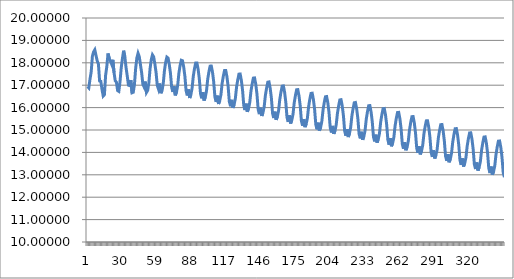
| Category | Series 0 |
|---|---|
| 0 | 16.938 |
| 1 | 16.879 |
| 2 | 17.272 |
| 3 | 17.599 |
| 4 | 18.294 |
| 5 | 18.489 |
| 6 | 18.58 |
| 7 | 18.329 |
| 8 | 18.087 |
| 9 | 17.94 |
| 10 | 17.188 |
| 11 | 17.172 |
| 12 | 16.805 |
| 13 | 16.517 |
| 14 | 16.576 |
| 15 | 17.443 |
| 16 | 17.838 |
| 17 | 18.416 |
| 18 | 18.199 |
| 19 | 18.082 |
| 20 | 17.944 |
| 21 | 18.134 |
| 22 | 17.564 |
| 23 | 17.202 |
| 24 | 17.134 |
| 25 | 16.757 |
| 26 | 16.724 |
| 27 | 17.165 |
| 28 | 17.783 |
| 29 | 18.194 |
| 30 | 18.541 |
| 31 | 18.272 |
| 32 | 17.789 |
| 33 | 17.416 |
| 34 | 17.002 |
| 35 | 16.983 |
| 36 | 17.225 |
| 37 | 16.662 |
| 38 | 16.685 |
| 39 | 17.031 |
| 40 | 17.749 |
| 41 | 18.217 |
| 42 | 18.428 |
| 43 | 18.281 |
| 44 | 17.919 |
| 45 | 17.555 |
| 46 | 17.044 |
| 47 | 16.927 |
| 48 | 17.162 |
| 49 | 16.676 |
| 50 | 16.769 |
| 51 | 17.101 |
| 52 | 17.737 |
| 53 | 18.137 |
| 54 | 18.353 |
| 55 | 18.268 |
| 56 | 17.952 |
| 57 | 17.569 |
| 58 | 16.993 |
| 59 | 16.828 |
| 60 | 17.075 |
| 61 | 16.643 |
| 62 | 16.771 |
| 63 | 17.083 |
| 64 | 17.664 |
| 65 | 18.025 |
| 66 | 18.253 |
| 67 | 18.212 |
| 68 | 17.924 |
| 69 | 17.524 |
| 70 | 16.899 |
| 71 | 16.7 |
| 72 | 16.951 |
| 73 | 16.547 |
| 74 | 16.692 |
| 75 | 16.988 |
| 76 | 17.535 |
| 77 | 17.876 |
| 78 | 18.112 |
| 79 | 18.092 |
| 80 | 17.813 |
| 81 | 17.398 |
| 82 | 16.751 |
| 83 | 16.544 |
| 84 | 16.81 |
| 85 | 16.429 |
| 86 | 16.585 |
| 87 | 16.873 |
| 88 | 17.405 |
| 89 | 17.742 |
| 90 | 17.992 |
| 91 | 17.99 |
| 92 | 17.717 |
| 93 | 17.292 |
| 94 | 16.629 |
| 95 | 16.415 |
| 96 | 16.687 |
| 97 | 16.317 |
| 98 | 16.474 |
| 99 | 16.751 |
| 100 | 17.269 |
| 101 | 17.6 |
| 102 | 17.852 |
| 103 | 17.853 |
| 104 | 17.578 |
| 105 | 17.143 |
| 106 | 16.472 |
| 107 | 16.257 |
| 108 | 16.533 |
| 109 | 16.162 |
| 110 | 16.312 |
| 111 | 16.575 |
| 112 | 17.08 |
| 113 | 17.404 |
| 114 | 17.657 |
| 115 | 17.658 |
| 116 | 17.38 |
| 117 | 16.941 |
| 118 | 16.269 |
| 119 | 16.06 |
| 120 | 16.347 |
| 121 | 15.986 |
| 122 | 16.139 |
| 123 | 16.403 |
| 124 | 16.908 |
| 125 | 17.236 |
| 126 | 17.494 |
| 127 | 17.501 |
| 128 | 17.222 |
| 129 | 16.779 |
| 130 | 16.102 |
| 131 | 15.889 |
| 132 | 16.175 |
| 133 | 15.814 |
| 134 | 15.967 |
| 135 | 16.228 |
| 136 | 16.731 |
| 137 | 17.058 |
| 138 | 17.317 |
| 139 | 17.325 |
| 140 | 17.048 |
| 141 | 16.603 |
| 142 | 15.923 |
| 143 | 15.708 |
| 144 | 15.992 |
| 145 | 15.628 |
| 146 | 15.778 |
| 147 | 16.036 |
| 148 | 16.54 |
| 149 | 16.87 |
| 150 | 17.134 |
| 151 | 17.147 |
| 152 | 16.872 |
| 153 | 16.428 |
| 154 | 15.748 |
| 155 | 15.532 |
| 156 | 15.817 |
| 157 | 15.454 |
| 158 | 15.604 |
| 159 | 15.862 |
| 160 | 16.365 |
| 161 | 16.695 |
| 162 | 16.958 |
| 163 | 16.968 |
| 164 | 16.691 |
| 165 | 16.247 |
| 166 | 15.571 |
| 167 | 15.361 |
| 168 | 15.651 |
| 169 | 15.291 |
| 170 | 15.443 |
| 171 | 15.701 |
| 172 | 16.204 |
| 173 | 16.534 |
| 174 | 16.796 |
| 175 | 16.804 |
| 176 | 16.525 |
| 177 | 16.079 |
| 178 | 15.403 |
| 179 | 15.195 |
| 180 | 15.487 |
| 181 | 15.128 |
| 182 | 15.279 |
| 183 | 15.538 |
| 184 | 16.042 |
| 185 | 16.373 |
| 186 | 16.635 |
| 187 | 16.642 |
| 188 | 16.36 |
| 189 | 15.913 |
| 190 | 15.238 |
| 191 | 15.031 |
| 192 | 15.325 |
| 193 | 14.968 |
| 194 | 15.121 |
| 195 | 15.381 |
| 196 | 15.886 |
| 197 | 16.218 |
| 198 | 16.483 |
| 199 | 16.493 |
| 200 | 16.215 |
| 201 | 15.771 |
| 202 | 15.096 |
| 203 | 14.889 |
| 204 | 15.183 |
| 205 | 14.827 |
| 206 | 14.98 |
| 207 | 15.241 |
| 208 | 15.746 |
| 209 | 16.078 |
| 210 | 16.342 |
| 211 | 16.354 |
| 212 | 16.077 |
| 213 | 15.632 |
| 214 | 14.956 |
| 215 | 14.748 |
| 216 | 15.041 |
| 217 | 14.687 |
| 218 | 14.844 |
| 219 | 15.108 |
| 220 | 15.616 |
| 221 | 15.95 |
| 222 | 16.216 |
| 223 | 16.228 |
| 224 | 15.951 |
| 225 | 15.508 |
| 226 | 14.833 |
| 227 | 14.627 |
| 228 | 14.92 |
| 229 | 14.563 |
| 230 | 14.717 |
| 231 | 14.978 |
| 232 | 15.485 |
| 233 | 15.818 |
| 234 | 16.082 |
| 235 | 16.091 |
| 236 | 15.811 |
| 237 | 15.366 |
| 238 | 14.694 |
| 239 | 14.492 |
| 240 | 14.79 |
| 241 | 14.436 |
| 242 | 14.591 |
| 243 | 14.852 |
| 244 | 15.357 |
| 245 | 15.689 |
| 246 | 15.951 |
| 247 | 15.96 |
| 248 | 15.679 |
| 249 | 15.232 |
| 250 | 14.555 |
| 251 | 14.345 |
| 252 | 14.635 |
| 253 | 14.275 |
| 254 | 14.425 |
| 255 | 14.683 |
| 256 | 15.186 |
| 257 | 15.518 |
| 258 | 15.78 |
| 259 | 15.786 |
| 260 | 15.504 |
| 261 | 15.055 |
| 262 | 14.376 |
| 263 | 14.167 |
| 264 | 14.457 |
| 265 | 14.097 |
| 266 | 14.247 |
| 267 | 14.504 |
| 268 | 15.006 |
| 269 | 15.335 |
| 270 | 15.595 |
| 271 | 15.6 |
| 272 | 15.317 |
| 273 | 14.868 |
| 274 | 14.19 |
| 275 | 13.98 |
| 276 | 14.271 |
| 277 | 13.912 |
| 278 | 14.063 |
| 279 | 14.321 |
| 280 | 14.822 |
| 281 | 15.15 |
| 282 | 15.409 |
| 283 | 15.413 |
| 284 | 15.13 |
| 285 | 14.682 |
| 286 | 14.005 |
| 287 | 13.797 |
| 288 | 14.089 |
| 289 | 13.73 |
| 290 | 13.879 |
| 291 | 14.137 |
| 292 | 14.642 |
| 293 | 14.975 |
| 294 | 15.238 |
| 295 | 15.245 |
| 296 | 14.962 |
| 297 | 14.512 |
| 298 | 13.834 |
| 299 | 13.626 |
| 300 | 13.918 |
| 301 | 13.56 |
| 302 | 13.712 |
| 303 | 13.969 |
| 304 | 14.47 |
| 305 | 14.797 |
| 306 | 15.056 |
| 307 | 15.062 |
| 308 | 14.781 |
| 309 | 14.333 |
| 310 | 13.655 |
| 311 | 13.443 |
| 312 | 13.732 |
| 313 | 13.371 |
| 314 | 13.52 |
| 315 | 13.777 |
| 316 | 14.279 |
| 317 | 14.608 |
| 318 | 14.869 |
| 319 | 14.875 |
| 320 | 14.593 |
| 321 | 14.145 |
| 322 | 13.468 |
| 323 | 13.258 |
| 324 | 13.549 |
| 325 | 13.19 |
| 326 | 13.34 |
| 327 | 13.597 |
| 328 | 14.098 |
| 329 | 14.425 |
| 330 | 14.686 |
| 331 | 14.694 |
| 332 | 14.414 |
| 333 | 13.968 |
| 334 | 13.29 |
| 335 | 13.078 |
| 336 | 13.366 |
| 337 | 13.002 |
| 338 | 13.149 |
| 339 | 13.404 |
| 340 | 13.907 |
| 341 | 14.238 |
| 342 | 14.502 |
| 343 | 14.51 |
| 344 | 14.23 |
| 345 | 13.782 |
| 346 | 13.104 |
| 347 | 12.892 |